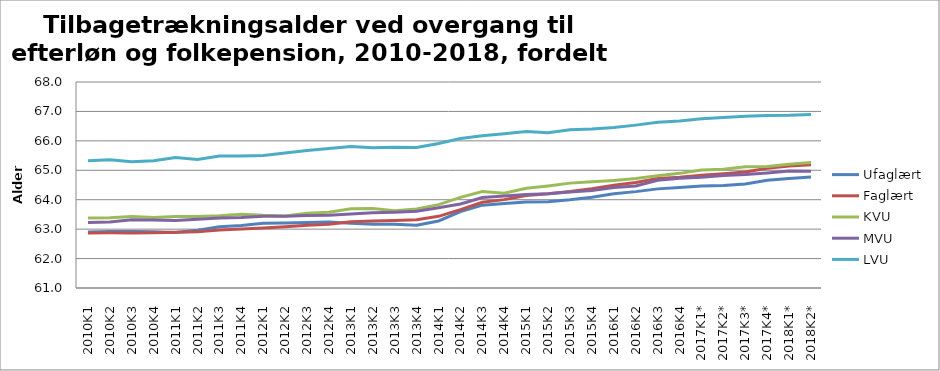
| Category | Ufaglært | Faglært | KVU | MVU | LVU |
|---|---|---|---|---|---|
| 2010K1 | 62.9 | 62.865 | 63.379 | 63.226 | 65.322 |
| 2010K2 | 62.917 | 62.875 | 63.384 | 63.242 | 65.357 |
| 2010K3 | 62.921 | 62.872 | 63.43 | 63.323 | 65.291 |
| 2010K4 | 62.911 | 62.875 | 63.393 | 63.309 | 65.321 |
| 2011K1 | 62.883 | 62.892 | 63.432 | 63.292 | 65.436 |
| 2011K2 | 62.964 | 62.91 | 63.433 | 63.336 | 65.368 |
| 2011K3 | 63.079 | 62.969 | 63.456 | 63.379 | 65.485 |
| 2011K4 | 63.125 | 63.004 | 63.509 | 63.397 | 65.482 |
| 2012K1 | 63.2 | 63.038 | 63.469 | 63.435 | 65.505 |
| 2012K2 | 63.211 | 63.085 | 63.449 | 63.44 | 65.587 |
| 2012K3 | 63.222 | 63.135 | 63.541 | 63.461 | 65.669 |
| 2012K4 | 63.239 | 63.168 | 63.571 | 63.474 | 65.737 |
| 2013K1 | 63.202 | 63.248 | 63.694 | 63.511 | 65.805 |
| 2013K2 | 63.165 | 63.276 | 63.701 | 63.558 | 65.768 |
| 2013K3 | 63.164 | 63.296 | 63.626 | 63.576 | 65.784 |
| 2013K4 | 63.134 | 63.318 | 63.687 | 63.608 | 65.772 |
| 2014K1 | 63.279 | 63.435 | 63.833 | 63.725 | 65.909 |
| 2014K2 | 63.598 | 63.665 | 64.08 | 63.857 | 66.079 |
| 2014K3 | 63.815 | 63.911 | 64.276 | 64.073 | 66.176 |
| 2014K4 | 63.875 | 64.003 | 64.223 | 64.124 | 66.242 |
| 2015K1 | 63.925 | 64.144 | 64.391 | 64.176 | 66.318 |
| 2015K2 | 63.934 | 64.199 | 64.469 | 64.206 | 66.273 |
| 2015K3 | 63.996 | 64.278 | 64.564 | 64.264 | 66.379 |
| 2015K4 | 64.085 | 64.377 | 64.609 | 64.314 | 66.406 |
| 2016K1 | 64.201 | 64.493 | 64.656 | 64.415 | 66.451 |
| 2016K2 | 64.275 | 64.587 | 64.718 | 64.47 | 66.534 |
| 2016K3 | 64.368 | 64.721 | 64.815 | 64.663 | 66.629 |
| 2016K4 | 64.415 | 64.765 | 64.895 | 64.73 | 66.677 |
| 2017K1* | 64.465 | 64.833 | 65.013 | 64.763 | 66.747 |
| 2017K2* | 64.481 | 64.882 | 65.039 | 64.823 | 66.795 |
| 2017K3* | 64.535 | 64.939 | 65.119 | 64.856 | 66.833 |
| 2017K4* | 64.66 | 65.067 | 65.129 | 64.909 | 66.861 |
| 2018K1* | 64.719 | 65.149 | 65.208 | 64.973 | 66.868 |
| 2018K2* | 64.769 | 65.187 | 65.268 | 64.971 | 66.893 |